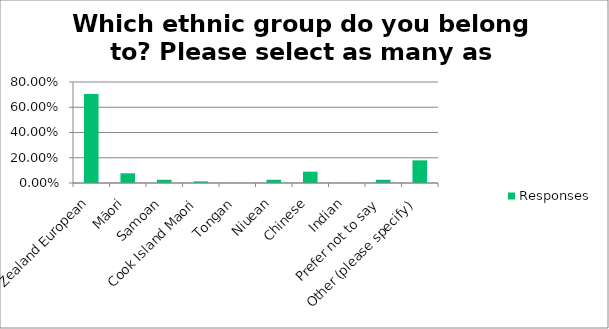
| Category | Responses |
|---|---|
| New Zealand European | 0.705 |
| Māori | 0.077 |
| Samoan | 0.026 |
| Cook Island Maori | 0.013 |
| Tongan | 0 |
| Niuean | 0.026 |
| Chinese | 0.09 |
| Indian | 0 |
| Prefer not to say | 0.026 |
| Other (please specify) | 0.18 |